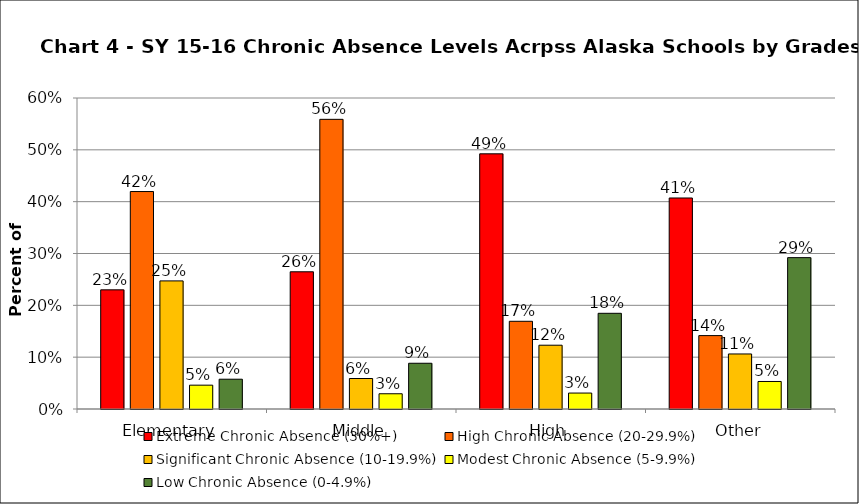
| Category | Extreme Chronic Absence (30%+) | High Chronic Absence (20-29.9%) | Significant Chronic Absence (10-19.9%) | Modest Chronic Absence (5-9.9%) | Low Chronic Absence (0-4.9%) |
|---|---|---|---|---|---|
| 0 | 0.23 | 0.42 | 0.247 | 0.046 | 0.057 |
| 1 | 0.265 | 0.559 | 0.059 | 0.029 | 0.088 |
| 2 | 0.492 | 0.169 | 0.123 | 0.031 | 0.185 |
| 3 | 0.407 | 0.142 | 0.106 | 0.053 | 0.292 |